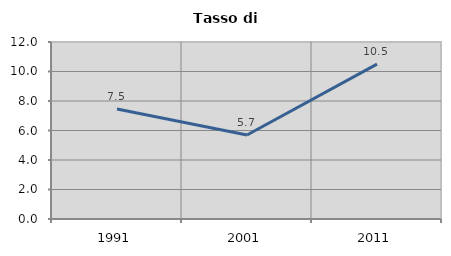
| Category | Tasso di disoccupazione   |
|---|---|
| 1991.0 | 7.463 |
| 2001.0 | 5.696 |
| 2011.0 | 10.497 |